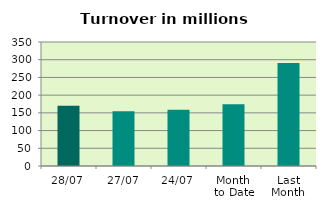
| Category | Series 0 |
|---|---|
| 28/07 | 169.998 |
| 27/07 | 154.46 |
| 24/07 | 158.661 |
| Month 
to Date | 173.943 |
| Last
Month | 290.981 |